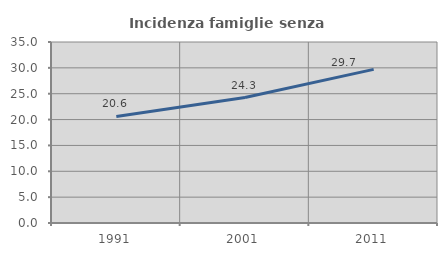
| Category | Incidenza famiglie senza nuclei |
|---|---|
| 1991.0 | 20.6 |
| 2001.0 | 24.26 |
| 2011.0 | 29.711 |